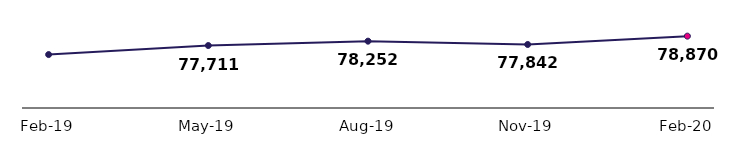
| Category | Claimant receiving benefit |
|---|---|
| 2019-02-01 | 76597 |
| 2019-05-01 | 77711 |
| 2019-08-01 | 78252 |
| 2019-11-01 | 77842 |
| 2020-02-01 | 78870 |